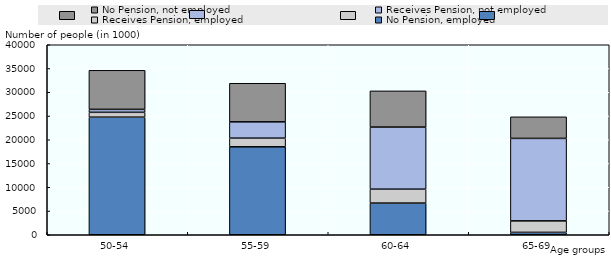
| Category | No Pension, employed  | Receives Pension, employed | Receives Pension, not employed | No Pension, not employed |
|---|---|---|---|---|
| 50-54 | 24755.7 | 1023.4 | 621 | 8218.9 |
| 55-59 | 18514 | 1827 | 3433.2 | 8120.7 |
| 60-64 | 6670.2 | 2926.8 | 13072.9 | 7621.5 |
| 65-69 | 498.7 | 2426.1 | 17363.3 | 4544.1 |